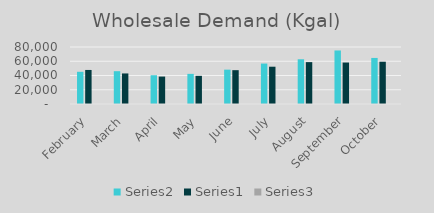
| Category | Series 1 | Series 0 | Series 2 |
|---|---|---|---|
| February | 45213 | 47777 | 0.946 |
| March | 46053 | 42881 | 1.074 |
| April | 40390 | 38510 | 1.049 |
| May | 42282 | 39535 | 1.069 |
| June | 48210 | 47488 | 1.015 |
| July | 56754 | 52336 | 1.084 |
| August | 62781 | 58778 | 1.068 |
| September | 75127 | 58188 | 1.291 |
| October | 64642 | 59318 | 1.09 |